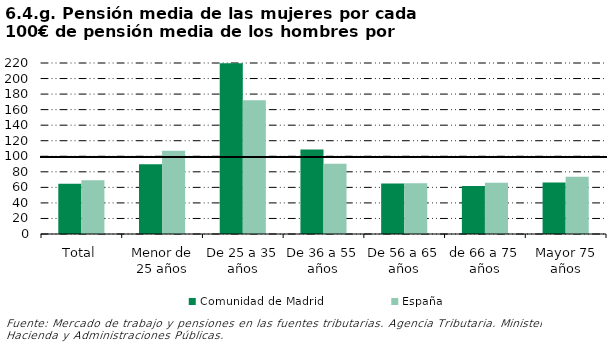
| Category | Comunidad de Madrid | España |
|---|---|---|
| Total | 64.512 | 69.221 |
| Menor de 25 años | 89.618 | 107.039 |
| De 25 a 35 años | 219.535 | 171.992 |
| De 36 a 55 años | 108.766 | 90.301 |
| De 56 a 65 años | 65.094 | 65.201 |
| de 66 a 75 años | 61.635 | 65.926 |
| Mayor 75 años | 66.307 | 73.775 |